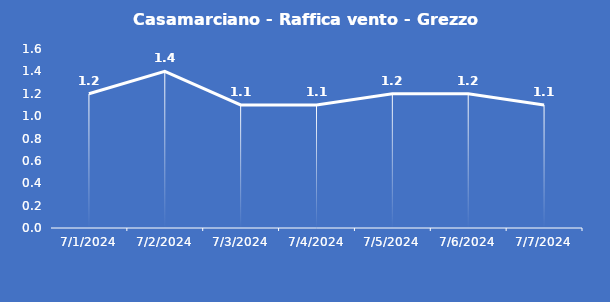
| Category | Casamarciano - Raffica vento - Grezzo (m/s) |
|---|---|
| 7/1/24 | 1.2 |
| 7/2/24 | 1.4 |
| 7/3/24 | 1.1 |
| 7/4/24 | 1.1 |
| 7/5/24 | 1.2 |
| 7/6/24 | 1.2 |
| 7/7/24 | 1.1 |